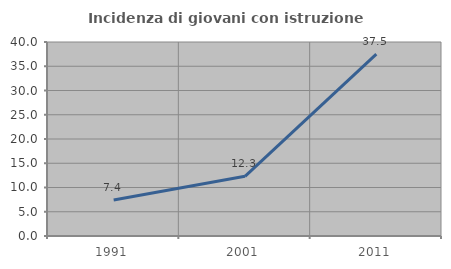
| Category | Incidenza di giovani con istruzione universitaria |
|---|---|
| 1991.0 | 7.407 |
| 2001.0 | 12.308 |
| 2011.0 | 37.5 |